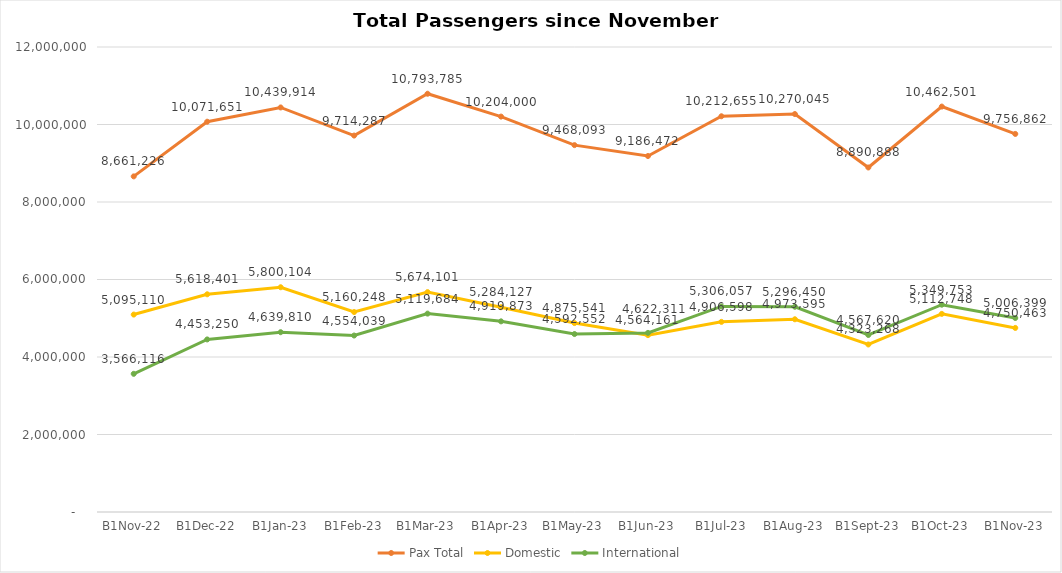
| Category | Pax Total | Domestic | International |
|---|---|---|---|
| 2022-11-01 | 8661226 | 5095110 | 3566116 |
| 2022-12-01 | 10071651 | 5618401 | 4453250 |
| 2023-01-01 | 10439914 | 5800104 | 4639810 |
| 2023-02-01 | 9714287 | 5160248 | 4554039 |
| 2023-03-01 | 10793785 | 5674101 | 5119684 |
| 2023-04-01 | 10204000 | 5284127 | 4919873 |
| 2023-05-01 | 9468093 | 4875541 | 4592552 |
| 2023-06-01 | 9186472 | 4564161 | 4622311 |
| 2023-07-01 | 10212655 | 4906598 | 5306057 |
| 2023-08-01 | 10270045 | 4973595 | 5296450 |
| 2023-09-01 | 8890888 | 4323268 | 4567620 |
| 2023-10-01 | 10462501 | 5112748 | 5349753 |
| 2023-11-01 | 9756862 | 4750463 | 5006399 |